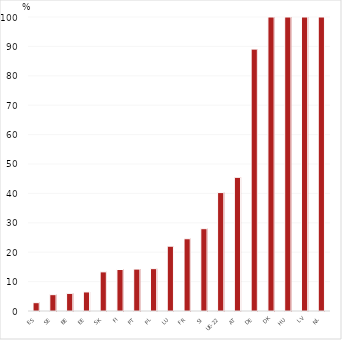
| Category | Proportion d'élèves de la filière professionnelle inscrits en apprentissage |
|---|---|
| ES | 2.831 |
| SE | 5.555 |
| BE | 5.99 |
| EE | 6.48 |
| SK | 13.309 |
| FI | 14.114 |
| PT | 14.262 |
| PL | 14.404 |
| LU | 22.044 |
| FR | 24.578 |
| SI | 28 |
| UE-22 | 40.278 |
| AT | 45.465 |
| DE | 89.073 |
| DK | 100 |
| HU | 100 |
| LV | 100 |
| NL | 100 |